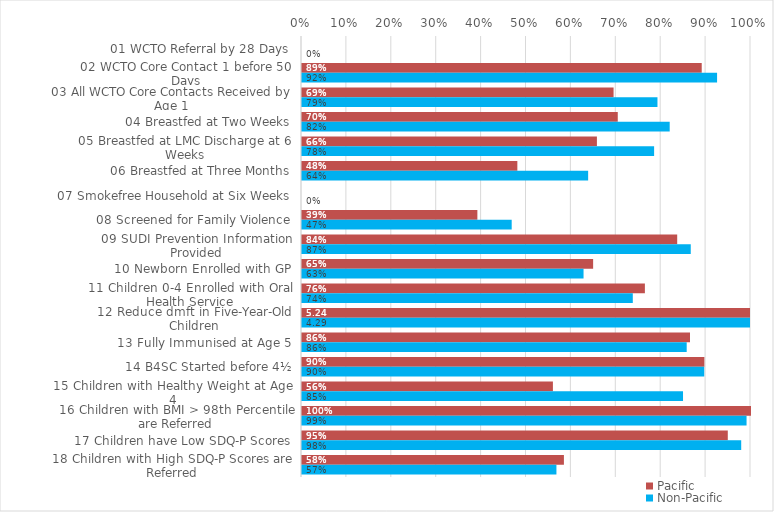
| Category | Pacific | Non-Pacific |
|---|---|---|
| 01 WCTO Referral by 28 Days | 0 | 0 |
| 02 WCTO Core Contact 1 before 50 Days | 0.89 | 0.924 |
| 03 All WCTO Core Contacts Received by Age 1 | 0.694 | 0.792 |
| 04 Breastfed at Two Weeks | 0.703 | 0.819 |
| 05 Breastfed at LMC Discharge at 6 Weeks | 0.657 | 0.784 |
| 06 Breastfed at Three Months | 0.48 | 0.637 |
| 07 Smokefree Household at Six Weeks | 0 | 0 |
| 08 Screened for Family Violence | 0.391 | 0.467 |
| 09 SUDI Prevention Information Provided | 0.836 | 0.866 |
| 10 Newborn Enrolled with GP | 0.648 | 0.627 |
| 11 Children 0-4 Enrolled with Oral Health Service | 0.764 | 0.737 |
| 12 Reduce dmft in Five-Year-Old Children | 5.241 | 4.291 |
| 13 Fully Immunised at Age 5 | 0.864 | 0.857 |
| 14 B4SC Started before 4½ | 0.896 | 0.896 |
| 15 Children with Healthy Weight at Age 4 | 0.559 | 0.849 |
| 16 Children with BMI > 98th Percentile are Referred | 1 | 0.99 |
| 17 Children have Low SDQ-P Scores | 0.948 | 0.978 |
| 18 Children with High SDQ-P Scores are Referred | 0.583 | 0.567 |